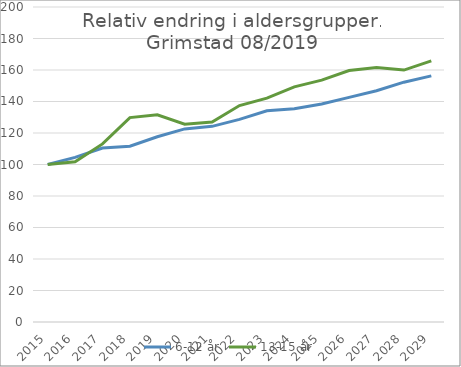
| Category | 6-12 år | 13-15 år |
|---|---|---|
| 2015.0 | 100 | 100 |
| 2016.0 | 104.522 | 101.672 |
| 2017.0 | 110.475 | 113.07 |
| 2018.0 | 111.563 | 129.787 |
| 2019.0 | 117.617 | 131.6 |
| 2020.0 | 122.599 | 125.583 |
| 2021.0 | 124.218 | 126.927 |
| 2022.0 | 128.62 | 137.436 |
| 2023.0 | 134.065 | 142.131 |
| 2024.0 | 135.403 | 149.277 |
| 2025.0 | 138.425 | 153.557 |
| 2026.0 | 142.613 | 159.658 |
| 2027.0 | 146.837 | 161.624 |
| 2028.0 | 152.266 | 159.968 |
| 2029.0 | 156.266 | 165.811 |